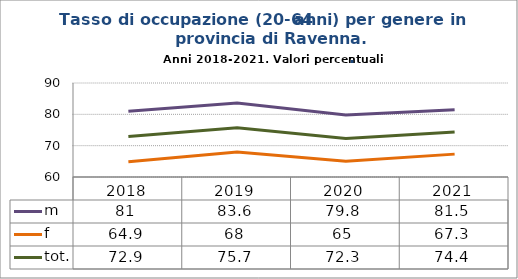
| Category | m | f | tot. |
|---|---|---|---|
| 2018.0 | 81 | 64.9 | 72.9 |
| 2019.0 | 83.6 | 68 | 75.7 |
| 2020.0 | 79.8 | 65 | 72.3 |
| 2021.0 | 81.5 | 67.3 | 74.4 |